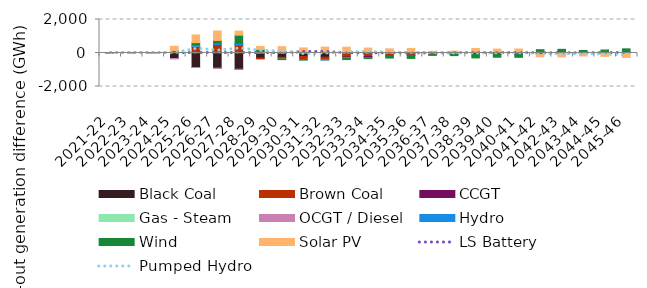
| Category | Black Coal | Brown Coal | CCGT | Gas - Steam | OCGT / Diesel | Hydro | Wind | Solar PV |
|---|---|---|---|---|---|---|---|---|
| 2021-22 | 0.089 | 0.032 | 0.015 | 0.001 | 0.008 | -0.002 | 0.001 | 5.93 |
| 2022-23 | 23.032 | 0.852 | 0.005 | -0.001 | 0.085 | -0.742 | 0.124 | -17.063 |
| 2023-24 | 22.258 | 0.27 | 0.03 | -0.002 | 0.008 | -0.217 | 0.565 | -14.725 |
| 2024-25 | -326.516 | 113.105 | -10.288 | -0.002 | -1.746 | 23.542 | 15.427 | 246.895 |
| 2025-26 | -866.303 | 405.068 | 0.005 | 0 | -0.005 | 92.787 | 122.298 | 459.012 |
| 2026-27 | -914.727 | 490.103 | 0.005 | -0.931 | -1.265 | 110.054 | 149.758 | 562.51 |
| 2027-28 | -967.957 | 496.278 | 0.005 | 0.036 | -0.743 | 89.106 | 479.363 | 240.708 |
| 2028-29 | -299.127 | -54.389 | 0.005 | 0 | 0.007 | 23.93 | 189.438 | 178.796 |
| 2029-30 | -261.772 | -108.288 | 0.006 | -0.007 | 0.007 | 8.659 | -24.66 | 372.753 |
| 2030-31 | -208.992 | -182.036 | -0.004 | -0.082 | -0.345 | -16.622 | -4.032 | 304.109 |
| 2031-32 | -250.459 | -147.653 | 0.007 | -0.438 | -0.54 | -22.124 | 51.876 | 300.761 |
| 2032-33 | -68.607 | -168.464 | -68.046 | -3.481 | -4.79 | 3.571 | -79.498 | 343.22 |
| 2033-34 | -49.667 | -160.459 | -65.673 | -1.29 | -9.802 | 0.525 | -46.905 | 291.941 |
| 2034-35 | -54.124 | -144.172 | 5.793 | 1.424 | 0.222 | 3.724 | -104.12 | 237.61 |
| 2035-36 | -24.534 | -115.048 | 17.723 | 0.672 | 9.176 | -2.291 | -181.388 | 244.931 |
| 2036-37 | 11.946 | -92.878 | 4.771 | 0.353 | 2.124 | 0.531 | -51.189 | 82.07 |
| 2037-38 | -4.079 | -83.282 | 5.236 | 0.714 | 6.359 | -2.742 | -65.342 | 99.611 |
| 2038-39 | 9.56 | -49.039 | 30.726 | 2.256 | 14.397 | 1.058 | -243.101 | 213.053 |
| 2039-40 | 4.641 | -63.735 | 24.689 | 0 | 9.596 | -0.335 | -188.666 | 193.419 |
| 2040-41 | -31.121 | -71.316 | 9.666 | 0 | 10.486 | -3.795 | -152.749 | 216.529 |
| 2041-42 | -13.915 | -34.944 | -20.225 | 0 | -22.1 | 0.904 | 197.458 | -131.165 |
| 2042-43 | -0.825 | 3.982 | 65.422 | 0 | -2.228 | -3.598 | 149.303 | -227.006 |
| 2043-44 | 10.831 | -6.796 | 59.266 | 0 | 11.628 | -1.564 | 69.972 | -166.565 |
| 2044-45 | -2.798 | -14.475 | 41.991 | 0 | -3.203 | -1.544 | 136.682 | -180.048 |
| 2045-46 | 1.92 | -2.437 | 59.024 | 0 | 1.3 | -4.746 | 185.766 | -263.28 |